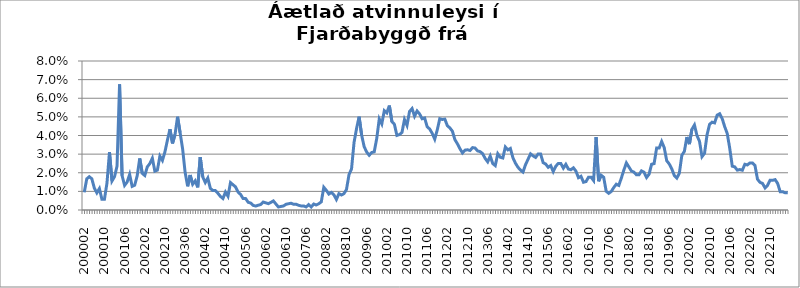
| Category | Series 0 |
|---|---|
| 200002 | 0.009 |
| 200003 | 0.017 |
| 200004 | 0.018 |
| 200005 | 0.017 |
| 200006 | 0.012 |
| 200007 | 0.009 |
| 200008 | 0.012 |
| 200009 | 0.006 |
| 200010 | 0.006 |
| 200011 | 0.014 |
| 200012 | 0.031 |
| 200101 | 0.016 |
| 200102 | 0.018 |
| 200103 | 0.024 |
| 200104 | 0.067 |
| 200105 | 0.018 |
| 200106 | 0.013 |
| 200107 | 0.015 |
| 200108 | 0.019 |
| 200109 | 0.013 |
| 200110 | 0.013 |
| 200111 | 0.018 |
| 200112 | 0.028 |
| 200201 | 0.02 |
| 200202 | 0.019 |
| 200203 | 0.023 |
| 200204 | 0.025 |
| 200205 | 0.028 |
| 200206 | 0.021 |
| 200207 | 0.021 |
| 200208 | 0.029 |
| 200209 | 0.027 |
| 200210 | 0.031 |
| 200211 | 0.038 |
| 200212 | 0.043 |
| 200301 | 0.036 |
| 200302 | 0.041 |
| 200303 | 0.05 |
| 200304 | 0.042 |
| 200305 | 0.033 |
| 200306 | 0.02 |
| 200307 | 0.013 |
| 200308 | 0.019 |
| 200309 | 0.014 |
| 200310 | 0.016 |
| 200311 | 0.012 |
| 200312 | 0.028 |
| 200401 | 0.018 |
| 200402 | 0.015 |
| 200403 | 0.017 |
| 200404 | 0.012 |
| 200405 | 0.01 |
| 200406 | 0.01 |
| 200407 | 0.009 |
| 200408 | 0.007 |
| 200409 | 0.006 |
| 200410 | 0.01 |
| 200411 | 0.007 |
| 200412 | 0.015 |
| 200501 | 0.014 |
| 200502 | 0.012 |
| 200503 | 0.01 |
| 200504 | 0.008 |
| 200505 | 0.006 |
| 200506 | 0.006 |
| 200507 | 0.004 |
| 200508 | 0.004 |
| 200509 | 0.002 |
| 200510 | 0.002 |
| 200511 | 0.003 |
| 200512 | 0.003 |
| 200601 | 0.004 |
| 200602 | 0.004 |
| 200603 | 0.003 |
| 200604 | 0.004 |
| 200605 | 0.005 |
| 200606 | 0.003 |
| 200607 | 0.002 |
| 200608 | 0.002 |
| 200609 | 0.002 |
| 200610 | 0.003 |
| 200611 | 0.003 |
| 200612 | 0.004 |
| 200701 | 0.003 |
| 200702 | 0.003 |
| 200703 | 0.003 |
| 200704 | 0.002 |
| 200705 | 0.002 |
| 200706 | 0.002 |
| 200707 | 0.003 |
| 200708 | 0.002 |
| 200709 | 0.003 |
| 200710 | 0.003 |
| 200711 | 0.003 |
| 200712 | 0.004 |
| 200801 | 0.012 |
| 200802 | 0.011 |
| 200803 | 0.009 |
| 200804 | 0.009 |
| 200805 | 0.008 |
| 200806 | 0.006 |
| 200807 | 0.009 |
| 200808 | 0.008 |
| 200809 | 0.009 |
| 200810 | 0.011 |
| 200811 | 0.019 |
| 200812 | 0.022 |
| 200901 | 0.036 |
| 200902 | 0.044 |
| 200903 | 0.05 |
| 200904 | 0.04 |
| 200905 | 0.034 |
| 200906 | 0.031 |
| 200907 | 0.029 |
| 200908 | 0.031 |
| 200909 | 0.031 |
| 200910 | 0.038 |
| 200911 | 0.049 |
| 200912 | 0.046 |
| 201001 | 0.053 |
| 201002 | 0.052 |
| 201003 | 0.056 |
| 201004 | 0.048 |
| 201005 | 0.046 |
| 201006 | 0.04 |
| 201007 | 0.04 |
| 201008 | 0.042 |
| 201009 | 0.049 |
| 201010 | 0.045 |
| 201011 | 0.053 |
| 201012 | 0.054 |
| 201101 | 0.05 |
| 201102 | 0.053 |
| 201103 | 0.052 |
| 201104 | 0.049 |
| 201105 | 0.049 |
| 201106 | 0.045 |
| 201107 | 0.043 |
| 201108 | 0.041 |
| 201109 | 0.038 |
| 201110 | 0.043 |
| 201111 | 0.049 |
| 201112 | 0.049 |
| 201201 | 0.049 |
| 201202 | 0.045 |
| 201203 | 0.044 |
| 201204 | 0.042 |
| 201205 | 0.038 |
| 201206 | 0.036 |
| 201207 | 0.033 |
| 201208 | 0.031 |
| 201209 | 0.032 |
| 201210 | 0.032 |
| 201211 | 0.032 |
| 201212 | 0.034 |
| 201301 | 0.033 |
| 201302 | 0.032 |
| 201303 | 0.031 |
| 201304 | 0.03 |
| 201305 | 0.028 |
| 201306 | 0.026 |
| 201307 | 0.029 |
| 201308 | 0.025 |
| 201309 | 0.024 |
| 201310 | 0.03 |
| 201311 | 0.028 |
| 201312 | 0.028 |
| 201401 | 0.034 |
| 201402 | 0.032 |
| 201403 | 0.033 |
| 201404 | 0.028 |
| 201405 | 0.025 |
| 201406 | 0.023 |
| 201407 | 0.021 |
| 201408 | 0.02 |
| 201409 | 0.024 |
| 201410 | 0.027 |
| 201411 | 0.03 |
| 201412 | 0.029 |
| 201501 | 0.028 |
| 201502 | 0.03 |
| 201503 | 0.03 |
| 201504 | 0.025 |
| 201505 | 0.025 |
| 201506 | 0.023 |
| 201507 | 0.024 |
| 201508 | 0.021 |
| 201509 | 0.023 |
| 201510 | 0.025 |
| 201511 | 0.025 |
| 201512 | 0.022 |
| 201601 | 0.025 |
| 201602 | 0.022 |
| 201603 | 0.022 |
| 201604 | 0.023 |
| 201605 | 0.021 |
| 201606 | 0.017 |
| 201607 | 0.018 |
| 201608 | 0.015 |
| 201609 | 0.015 |
| 201610 | 0.018 |
| 201611 | 0.018 |
| 201612 | 0.016 |
| 201701 | 0.039 |
| 201702 | 0.015 |
| 201703 | 0.019 |
| 201704 | 0.018 |
| 201705 | 0.01 |
| 201706 | 0.009 |
| 201707 | 0.01 |
| 201708 | 0.012 |
| 201709 | 0.014 |
| 201710 | 0.013 |
| 201711 | 0.017 |
| 201712 | 0.021 |
| 201801 | 0.025 |
| 201802 | 0.023 |
| 201803 | 0.021 |
| 201804 | 0.02 |
| 201805 | 0.019 |
| 201806 | 0.019 |
| 201807 | 0.021 |
| 201808 | 0.02 |
| 201809 | 0.017 |
| 201810 | 0.019 |
| 201811 | 0.025 |
| 201812 | 0.025 |
| 201901 | 0.033 |
| 201902 | 0.033 |
| 201903 | 0.037 |
| 201904 | 0.034 |
| 201905 | 0.026 |
| 201906 | 0.025 |
| 201907 | 0.022 |
| 201908 | 0.019 |
| 201909 | 0.017 |
| 201910 | 0.02 |
| 201911 | 0.029 |
| 201912 | 0.031 |
| 202001 | 0.039 |
| 202002 | 0.035 |
| 202003*** | 0.043 |
| 202004 | 0.046 |
| 202005 | 0.04 |
| 202006 | 0.037 |
| 202007 | 0.029 |
| 202008 | 0.03 |
| 202009 | 0.04 |
| 202010 | 0.046 |
| 202011 | 0.047 |
| 202012 | 0.047 |
| 202101 | 0.051 |
| 202102 | 0.052 |
| 202103 | 0.049 |
| 202104 | 0.045 |
| 202105 | 0.041 |
| 202106 | 0.033 |
| 202107 | 0.024 |
| 202108 | 0.023 |
| 202109 | 0.021 |
| 202110 | 0.022 |
| 202111 | 0.021 |
| 202112 | 0.025 |
| 202201 | 0.024 |
| 202202 | 0.025 |
| 202203 | 0.025 |
| 202204 | 0.024 |
| 202205 | 0.017 |
| 202206 | 0.015 |
| 202207 | 0.014 |
| 202208 | 0.012 |
| 202209 | 0.013 |
| 202210 | 0.016 |
| 202211 | 0.016 |
| 202212 | 0.016 |
| 202301 | 0.014 |
| 202302 | 0.01 |
| 202303 | 0.01 |
| 202304 | 0.009 |
| 202305 | 0.009 |